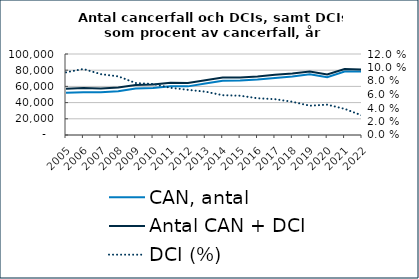
| Category | CAN, antal | Antal CAN + DCI |
|---|---|---|
| 2005.0 | 52215 | 57061 |
| 2006.0 | 52787 | 57949 |
| 2007.0 | 52710 | 57461 |
| 2008.0 | 54078 | 58777 |
| 2009.0 | 57389 | 61809 |
| 2010.0 | 57927 | 62309 |
| 2011.0 | 60279 | 64496 |
| 2012.0 | 60045 | 64063 |
| 2013.0 | 63491 | 67569 |
| 2014.0 | 66977 | 70926 |
| 2015.0 | 67206 | 71118 |
| 2016.0 | 68577 | 72310 |
| 2017.0 | 70519 | 74262 |
| 2018.0 | 72296 | 75855 |
| 2019.0 | 75017 | 78270 |
| 2020.0 | 71462 | 74675 |
| 2021.0 | 78313 | 81344 |
| 2022.0 | 78451 | 80719 |